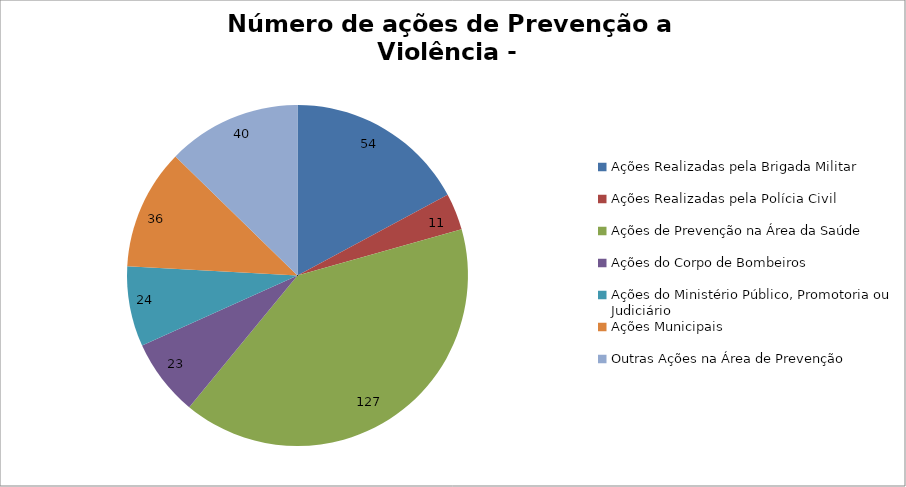
| Category | Número de Ações |
|---|---|
| Ações Realizadas pela Brigada Militar | 54 |
| Ações Realizadas pela Polícia Civil | 11 |
| Ações de Prevenção na Área da Saúde | 127 |
| Ações do Corpo de Bombeiros | 23 |
| Ações do Ministério Público, Promotoria ou Judiciário | 24 |
| Ações Municipais | 36 |
| Outras Ações na Área de Prevenção | 40 |